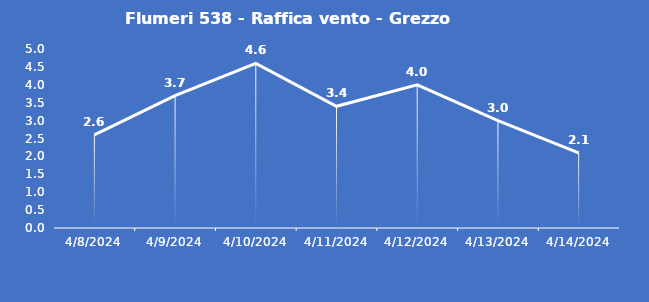
| Category | Flumeri 538 - Raffica vento - Grezzo (m/s) |
|---|---|
| 4/8/24 | 2.6 |
| 4/9/24 | 3.7 |
| 4/10/24 | 4.6 |
| 4/11/24 | 3.4 |
| 4/12/24 | 4 |
| 4/13/24 | 3 |
| 4/14/24 | 2.1 |